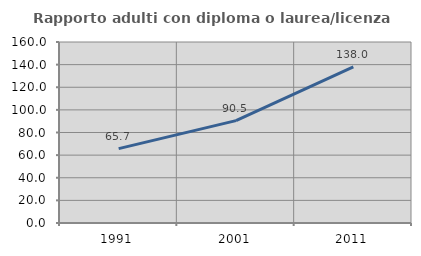
| Category | Rapporto adulti con diploma o laurea/licenza media  |
|---|---|
| 1991.0 | 65.748 |
| 2001.0 | 90.501 |
| 2011.0 | 137.972 |